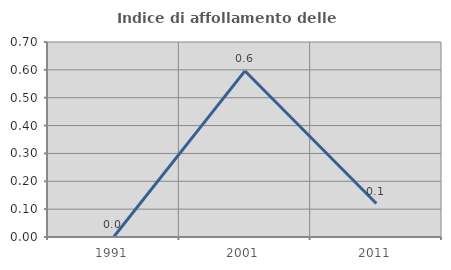
| Category | Indice di affollamento delle abitazioni  |
|---|---|
| 1991.0 | 0 |
| 2001.0 | 0.596 |
| 2011.0 | 0.12 |